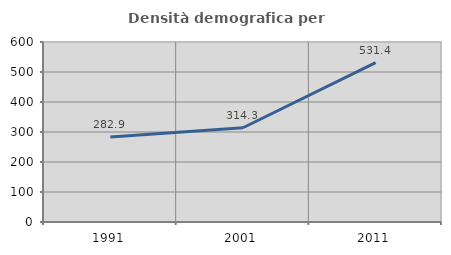
| Category | Densità demografica |
|---|---|
| 1991.0 | 282.933 |
| 2001.0 | 314.254 |
| 2011.0 | 531.412 |